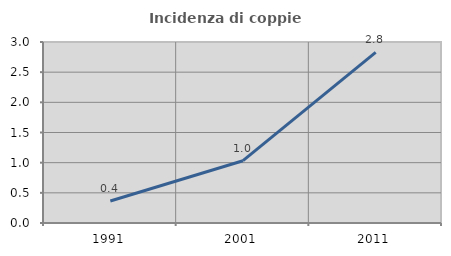
| Category | Incidenza di coppie miste |
|---|---|
| 1991.0 | 0.364 |
| 2001.0 | 1.033 |
| 2011.0 | 2.827 |